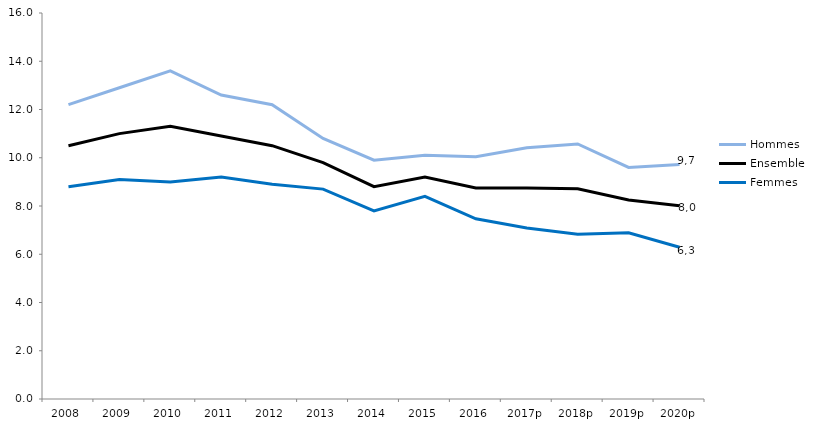
| Category | Hommes | Ensemble | Femmes  |
|---|---|---|---|
| 2008 | 12.2 | 10.5 | 8.8 |
| 2009 | 12.9 | 11 | 9.1 |
| 2010 | 13.6 | 11.3 | 9 |
| 2011 | 12.6 | 10.9 | 9.2 |
| 2012 | 12.2 | 10.5 | 8.9 |
| 2013 | 10.8 | 9.8 | 8.7 |
| 2014 | 9.9 | 8.8 | 7.8 |
| 2015 | 10.1 | 9.2 | 8.4 |
| 2016 | 10.04 | 8.75 | 7.47 |
| 2017p | 10.41 | 8.75 | 7.09 |
| 2018p | 10.57 | 8.71 | 6.83 |
| 2019p | 9.6 | 8.25 | 6.89 |
| 2020p | 9.72 | 8.01 | 6.29 |